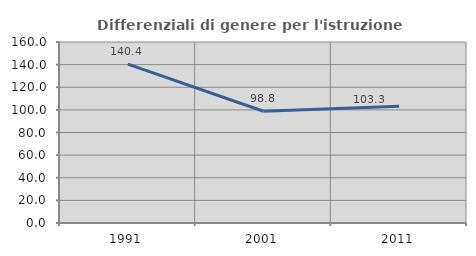
| Category | Differenziali di genere per l'istruzione superiore |
|---|---|
| 1991.0 | 140.387 |
| 2001.0 | 98.77 |
| 2011.0 | 103.264 |